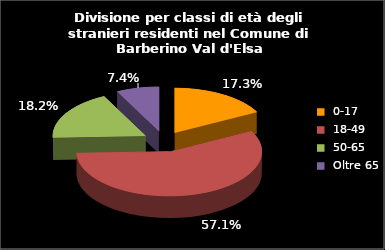
| Category | Series 0 |
|---|---|
| 0-17 | 56 |
| 18-49 | 185 |
| 50-65 | 59 |
| Oltre 65 | 24 |